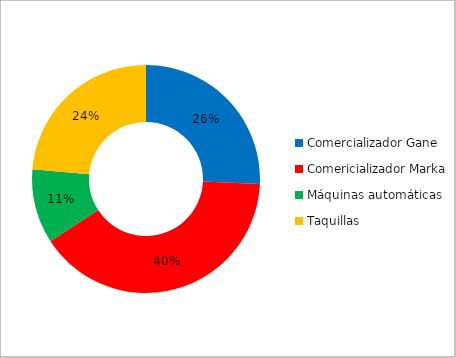
| Category | Series 0 |
|---|---|
| Comercializador Gane | 0.257 |
| Comericializador Marka | 0.401 |
| Máquinas automáticas | 0.105 |
| Taquillas | 0.237 |